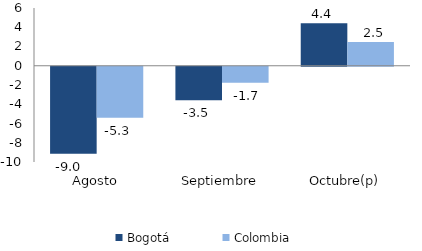
| Category | Bogotá | Colombia |
|---|---|---|
| Agosto | -9.039 | -5.307 |
| Septiembre | -3.471 | -1.672 |
| Octubre(p) | 4.416 | 2.47 |